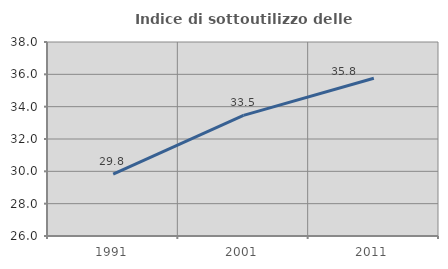
| Category | Indice di sottoutilizzo delle abitazioni  |
|---|---|
| 1991.0 | 29.832 |
| 2001.0 | 33.459 |
| 2011.0 | 35.762 |